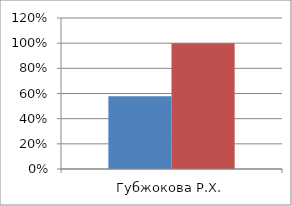
| Category | Series 0 | 2 |
|---|---|---|
| Губжокова Р.Х. | 0.577 | 1 |